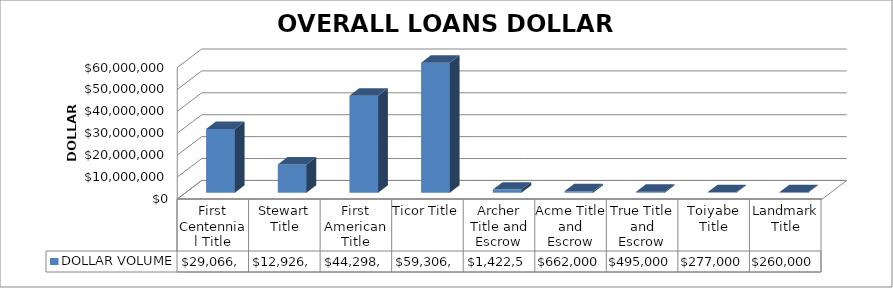
| Category | DOLLAR VOLUME |
|---|---|
| First Centennial Title | 29066657 |
| Stewart Title | 12926582 |
| First American Title | 44298141 |
| Ticor Title | 59306834 |
| Archer Title and Escrow | 1422500 |
| Acme Title and Escrow | 662000 |
| True Title and Escrow | 495000 |
| Toiyabe Title | 277000 |
| Landmark Title | 260000 |